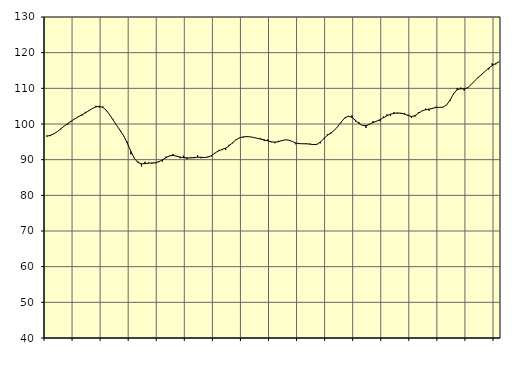
| Category | Piggar | Samtliga fast anställda (inkl. fast anställda utomlands) |
|---|---|---|
| nan | 96.8 | 96.53 |
| 87.0 | 96.6 | 96.85 |
| 87.0 | 97.3 | 97.23 |
| 87.0 | 97.8 | 97.84 |
| nan | 98.5 | 98.64 |
| 88.0 | 99.5 | 99.43 |
| 88.0 | 99.9 | 100.15 |
| 88.0 | 100.7 | 100.82 |
| nan | 101.5 | 101.44 |
| 89.0 | 102.2 | 102.02 |
| 89.0 | 102.3 | 102.57 |
| 89.0 | 103.4 | 103.11 |
| nan | 103.8 | 103.72 |
| 90.0 | 104.4 | 104.33 |
| 90.0 | 105.1 | 104.8 |
| 90.0 | 104.6 | 104.96 |
| nan | 104.9 | 104.65 |
| 91.0 | 103.6 | 103.81 |
| 91.0 | 102.5 | 102.5 |
| 91.0 | 101.2 | 101 |
| nan | 99.5 | 99.51 |
| 92.0 | 97.9 | 98.11 |
| 92.0 | 96.6 | 96.56 |
| 92.0 | 95 | 94.54 |
| nan | 91.5 | 92.28 |
| 93.0 | 90.5 | 90.35 |
| 93.0 | 89.5 | 89.22 |
| 93.0 | 88.1 | 88.84 |
| nan | 89.4 | 88.89 |
| 94.0 | 89.2 | 89.02 |
| 94.0 | 88.9 | 89.08 |
| 94.0 | 89 | 89.14 |
| nan | 89.6 | 89.43 |
| 95.0 | 89.4 | 89.95 |
| 95.0 | 90.9 | 90.58 |
| 95.0 | 91 | 91.08 |
| nan | 91.6 | 91.19 |
| 96.0 | 90.9 | 90.98 |
| 96.0 | 90.4 | 90.73 |
| 96.0 | 91.1 | 90.58 |
| nan | 90.1 | 90.51 |
| 97.0 | 90.7 | 90.48 |
| 97.0 | 90.4 | 90.59 |
| 97.0 | 91.2 | 90.7 |
| nan | 90.4 | 90.67 |
| 98.0 | 90.5 | 90.6 |
| 98.0 | 90.9 | 90.74 |
| 98.0 | 90.9 | 91.19 |
| nan | 91.9 | 91.87 |
| 99.0 | 92.7 | 92.49 |
| 99.0 | 93 | 92.87 |
| 99.0 | 92.7 | 93.23 |
| nan | 94.2 | 93.86 |
| 0.0 | 94.6 | 94.76 |
| 0.0 | 95.7 | 95.6 |
| 0.0 | 96.2 | 96.12 |
| nan | 96.2 | 96.39 |
| 1.0 | 96.6 | 96.45 |
| 1.0 | 96.4 | 96.4 |
| 1.0 | 96.2 | 96.23 |
| nan | 96 | 95.99 |
| 2.0 | 96 | 95.77 |
| 2.0 | 95.2 | 95.55 |
| 2.0 | 95.7 | 95.28 |
| nan | 94.9 | 95.01 |
| 3.0 | 94.6 | 94.91 |
| 3.0 | 95.3 | 95.02 |
| 3.0 | 95.5 | 95.34 |
| nan | 95.5 | 95.57 |
| 4.0 | 95.5 | 95.47 |
| 4.0 | 95.1 | 95.09 |
| 4.0 | 94.3 | 94.68 |
| nan | 94.6 | 94.49 |
| 5.0 | 94.5 | 94.46 |
| 5.0 | 94.6 | 94.44 |
| 5.0 | 94.5 | 94.36 |
| nan | 94.3 | 94.21 |
| 6.0 | 94.2 | 94.29 |
| 6.0 | 94.6 | 94.92 |
| 6.0 | 96.1 | 95.92 |
| nan | 97.1 | 96.83 |
| 7.0 | 97.3 | 97.5 |
| 7.0 | 98.2 | 98.24 |
| 7.0 | 99.4 | 99.35 |
| nan | 100.5 | 100.63 |
| 8.0 | 101.6 | 101.74 |
| 8.0 | 102.2 | 102.19 |
| 8.0 | 102.4 | 101.86 |
| nan | 100.7 | 101.05 |
| 9.0 | 100.5 | 100.15 |
| 9.0 | 99.6 | 99.59 |
| 9.0 | 98.9 | 99.52 |
| nan | 100 | 99.91 |
| 10.0 | 100.8 | 100.41 |
| 10.0 | 100.7 | 100.78 |
| 10.0 | 100.8 | 101.21 |
| nan | 102.1 | 101.77 |
| 11.0 | 102.7 | 102.32 |
| 11.0 | 102.3 | 102.75 |
| 11.0 | 103.3 | 103 |
| nan | 102.9 | 103.1 |
| 12.0 | 102.9 | 103.04 |
| 12.0 | 103.1 | 102.78 |
| 12.0 | 102.6 | 102.38 |
| nan | 101.7 | 102.09 |
| 13.0 | 102.1 | 102.34 |
| 13.0 | 103.3 | 103.04 |
| 13.0 | 103.7 | 103.68 |
| nan | 104.3 | 103.99 |
| 14.0 | 103.7 | 104.17 |
| 14.0 | 104.3 | 104.41 |
| 14.0 | 104.9 | 104.62 |
| nan | 104.7 | 104.67 |
| 15.0 | 104.7 | 104.74 |
| 15.0 | 105.3 | 105.35 |
| 15.0 | 106.5 | 106.72 |
| nan | 108.6 | 108.48 |
| 16.0 | 110.1 | 109.63 |
| 16.0 | 110.2 | 109.89 |
| 16.0 | 109.4 | 109.84 |
| nan | 110.3 | 110.16 |
| 17.0 | 111 | 111.04 |
| 17.0 | 112.1 | 112.09 |
| 17.0 | 112.9 | 113.07 |
| nan | 113.7 | 113.93 |
| 18.0 | 114.8 | 114.8 |
| 18.0 | 115.3 | 115.68 |
| 18.0 | 117 | 116.4 |
| nan | 116.7 | 116.95 |
| 19.0 | 117.5 | 117.47 |